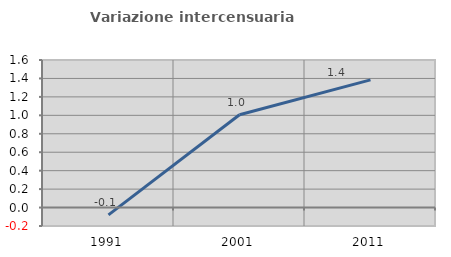
| Category | Variazione intercensuaria annua |
|---|---|
| 1991.0 | -0.08 |
| 2001.0 | 1.006 |
| 2011.0 | 1.385 |